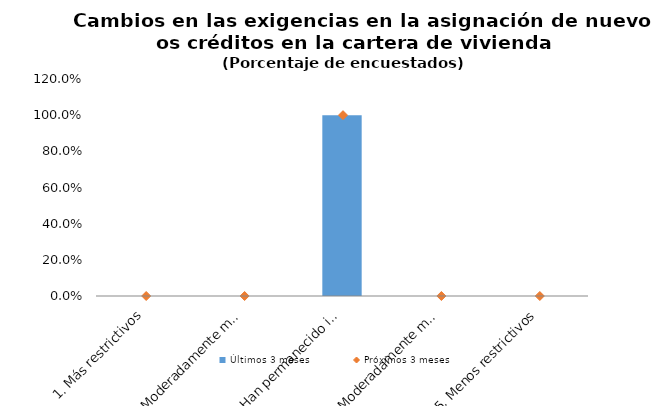
| Category | Últimos 3 meses |
|---|---|
| 1. Más restrictivos | 0 |
| 2. Moderadamente más restrictivos | 0 |
| 3. Han permanecido igual | 1 |
| 4. Moderadamente menos restrictivos | 0 |
| 5. Menos restrictivos | 0 |